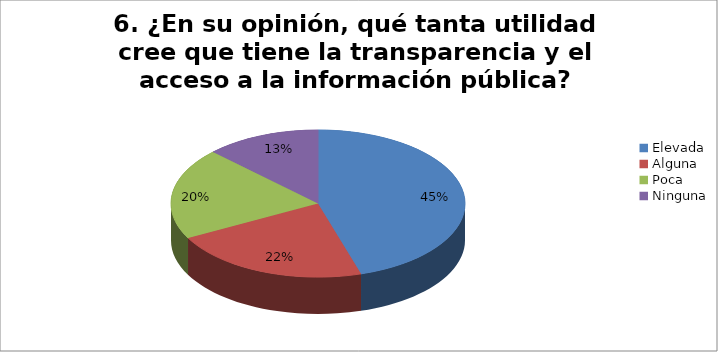
| Category | Series 0 |
|---|---|
| Elevada | 0.453 |
| Alguna | 0.22 |
| Poca | 0.201 |
| Ninguna | 0.127 |